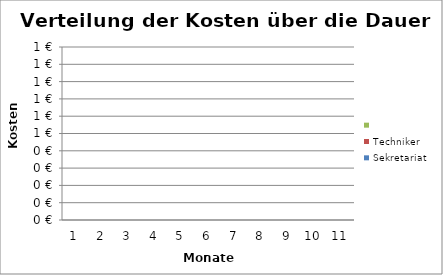
| Category | Sekretariat | Techniker | Series 1 |
|---|---|---|---|
| 1.0 | 0 | 0 | 0 |
| 2.0 | 0 | 0 | 0 |
| 3.0 | 0 | 0 | 0 |
| 4.0 | 0 | 0 | 0 |
| 5.0 | 0 | 0 | 0 |
| 6.0 | 0 | 0 | 0 |
| 7.0 | 0 | 0 | 0 |
| 8.0 | 0 | 0 | 0 |
| 9.0 | 0 | 0 | 0 |
| 10.0 | 0 | 0 | 0 |
| 11.0 | 0 | 0 | 0 |